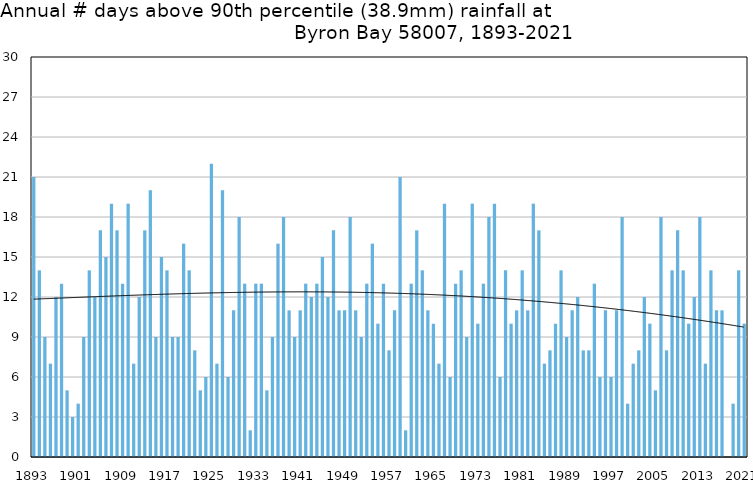
| Category | Annual # days above 90th percentile |
|---|---|
| 1893 | 21 |
| 1894 | 14 |
| 1895 | 9 |
| 1896 | 7 |
| 1897 | 12 |
| 1898 | 13 |
| 1899 | 5 |
| 1900 | 3 |
| 1901 | 4 |
| 1902 | 9 |
| 1903 | 14 |
| 1904 | 12 |
| 1905 | 17 |
| 1906 | 15 |
| 1907 | 19 |
| 1908 | 17 |
| 1909 | 13 |
| 1910 | 19 |
| 1911 | 7 |
| 1912 | 12 |
| 1913 | 17 |
| 1914 | 20 |
| 1915 | 9 |
| 1916 | 15 |
| 1917 | 14 |
| 1918 | 9 |
| 1919 | 9 |
| 1920 | 16 |
| 1921 | 14 |
| 1922 | 8 |
| 1923 | 5 |
| 1924 | 6 |
| 1925 | 22 |
| 1926 | 7 |
| 1927 | 20 |
| 1928 | 6 |
| 1929 | 11 |
| 1930 | 18 |
| 1931 | 13 |
| 1932 | 2 |
| 1933 | 13 |
| 1934 | 13 |
| 1935 | 5 |
| 1936 | 9 |
| 1937 | 16 |
| 1938 | 18 |
| 1939 | 11 |
| 1940 | 9 |
| 1941 | 11 |
| 1942 | 13 |
| 1943 | 12 |
| 1944 | 13 |
| 1945 | 15 |
| 1946 | 12 |
| 1947 | 17 |
| 1948 | 11 |
| 1949 | 11 |
| 1950 | 18 |
| 1951 | 11 |
| 1952 | 9 |
| 1953 | 13 |
| 1954 | 16 |
| 1955 | 10 |
| 1956 | 13 |
| 1957 | 8 |
| 1958 | 11 |
| 1959 | 21 |
| 1960 | 2 |
| 1961 | 13 |
| 1962 | 17 |
| 1963 | 14 |
| 1964 | 11 |
| 1965 | 10 |
| 1966 | 7 |
| 1967 | 19 |
| 1968 | 6 |
| 1969 | 13 |
| 1970 | 14 |
| 1971 | 9 |
| 1972 | 19 |
| 1973 | 10 |
| 1974 | 13 |
| 1975 | 18 |
| 1976 | 19 |
| 1977 | 6 |
| 1978 | 14 |
| 1979 | 10 |
| 1980 | 11 |
| 1981 | 14 |
| 1982 | 11 |
| 1983 | 19 |
| 1984 | 17 |
| 1985 | 7 |
| 1986 | 8 |
| 1987 | 10 |
| 1988 | 14 |
| 1989 | 9 |
| 1990 | 11 |
| 1991 | 12 |
| 1992 | 8 |
| 1993 | 8 |
| 1994 | 13 |
| 1995 | 6 |
| 1996 | 11 |
| 1997 | 6 |
| 1998 | 11 |
| 1999 | 18 |
| 2000 | 4 |
| 2001 | 7 |
| 2002 | 8 |
| 2003 | 12 |
| 2004 | 10 |
| 2005 | 5 |
| 2006 | 18 |
| 2007 | 8 |
| 2008 | 14 |
| 2009 | 17 |
| 2010 | 14 |
| 2011 | 10 |
| 2012 | 12 |
| 2013 | 18 |
| 2014 | 7 |
| 2015 | 14 |
| 2016 | 11 |
| 2017 | 11 |
| 2018 | 0 |
| 2019 | 4 |
| 2020 | 14 |
| 2021 | 10 |